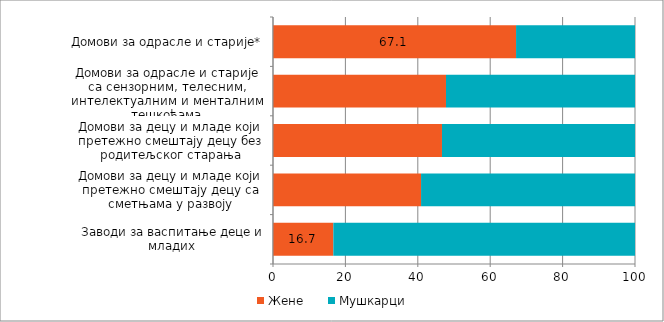
| Category | Жене | Мушкарци |
|---|---|---|
| Заводи за васпитање деце и младих | 16.667 | 83.333 |
| Домови за децу и младе који претежно смештају децу са сметњама у развоју | 40.899 | 59.101 |
| Домови за децу и младе који претежно смештају децу без родитељског старања | 46.679 | 53.321 |
| Домови за одрасле и старије са сензорним, телесним, интелектуалним и менталним тешкоћама | 47.788 | 52.212 |
| Домови за одрасле и старије* | 67.141 | 32.859 |